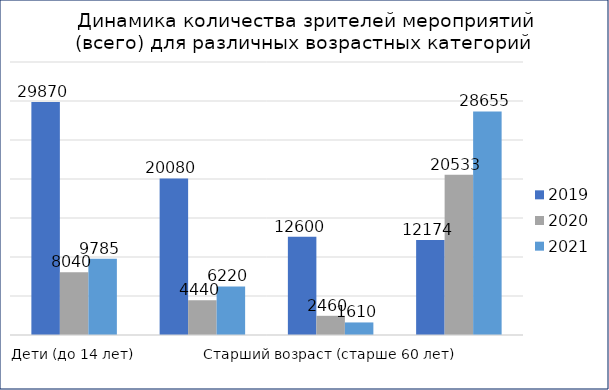
| Category | 2019 | 2020 | 2021 |
|---|---|---|---|
| Дети (до 14 лет) | 29870 | 8040 | 9785 |
| Молодой возраст (14-35 лет) | 20080 | 4440 | 6220 |
| Старший возраст (старше 60 лет) | 12600 | 2460 | 1610 |
| Смешанный возраст (для любого возраста) | 12174 | 20533 | 28655 |